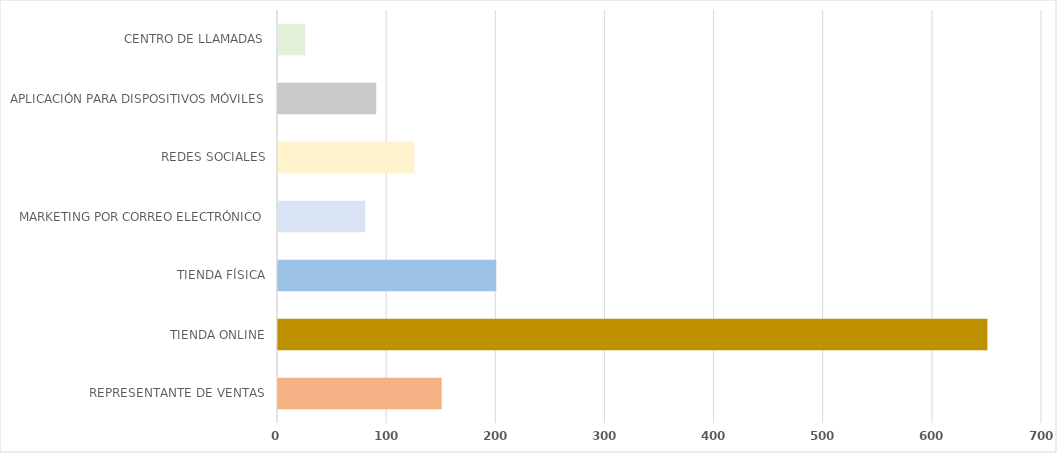
| Category | Series 0 |
|---|---|
| REPRESENTANTE DE VENTAS | 150 |
| TIENDA ONLINE | 650 |
| TIENDA FÍSICA | 200 |
| MARKETING POR CORREO ELECTRÓNICO | 80 |
| REDES SOCIALES | 125 |
| APLICACIÓN PARA DISPOSITIVOS MÓVILES | 90 |
| CENTRO DE LLAMADAS | 25 |